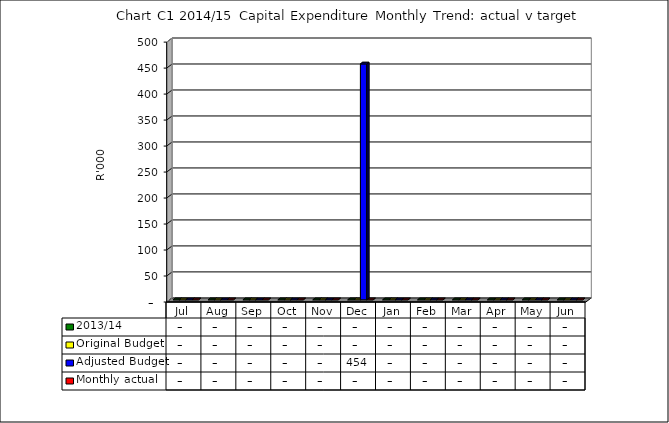
| Category | 2013/14 | Original Budget | Adjusted Budget | Monthly actual |
|---|---|---|---|---|
| Jul | 0 | 0 | 0 | 0 |
| Aug | 0 | 0 | 0 | 0 |
| Sep | 0 | 0 | 0 | 0 |
| Oct | 0 | 0 | 0 | 0 |
| Nov | 0 | 0 | 0 | 0 |
| Dec | 0 | 0 | 453840 | 0 |
| Jan | 0 | 0 | 0 | 0 |
| Feb | 0 | 0 | 0 | 0 |
| Mar | 0 | 0 | 0 | 0 |
| Apr | 0 | 0 | 0 | 0 |
| May | 0 | 0 | 0 | 0 |
| Jun | 0 | 0 | 0 | 0 |